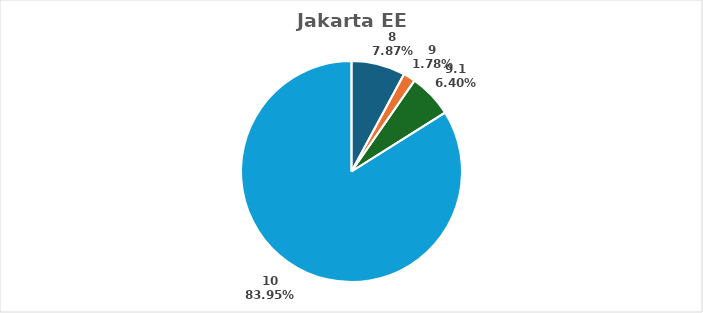
| Category | 8 |
|---|---|
| 8.0 | 0.079 |
| 9.0 | 0.018 |
| 9.1 | 0.064 |
| 10.0 | 0.839 |